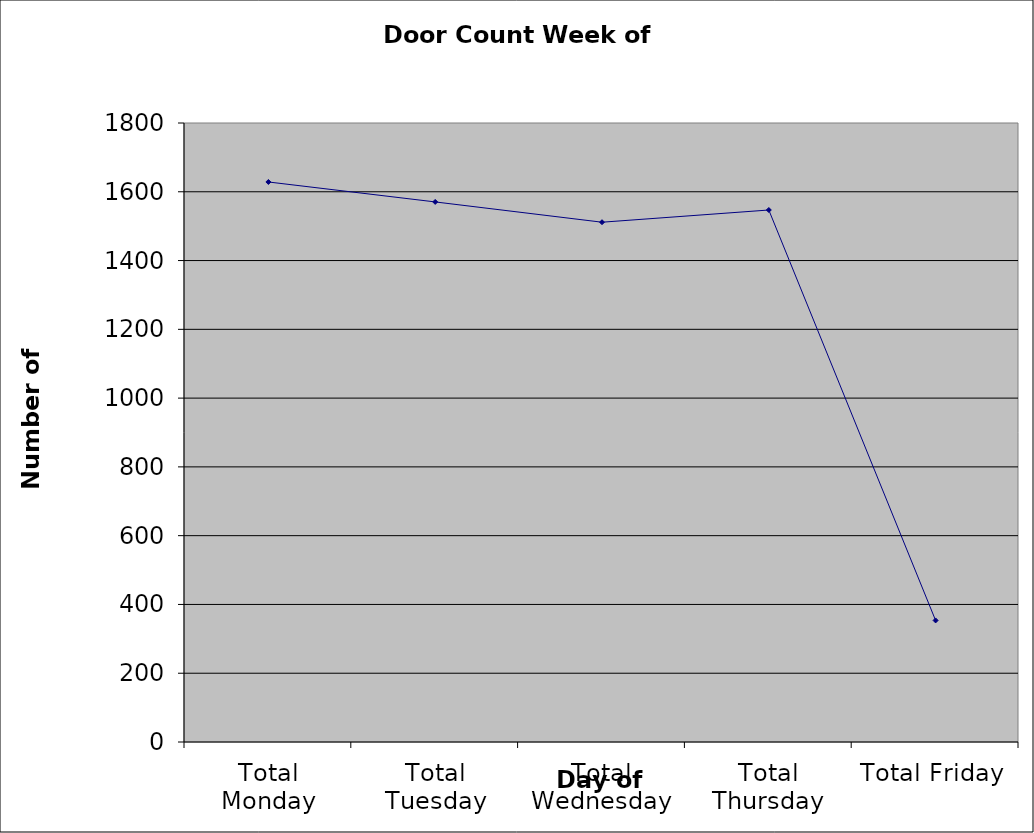
| Category | Series 0 |
|---|---|
| Total Monday | 1628.5 |
| Total Tuesday | 1570.5 |
| Total Wednesday | 1511.5 |
| Total Thursday | 1547 |
| Total Friday | 353.5 |